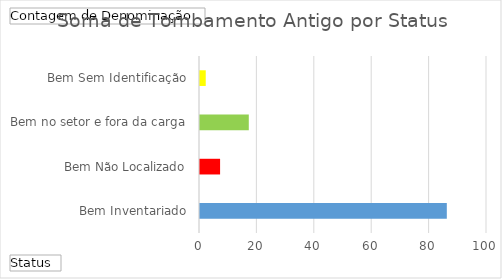
| Category | Total |
|---|---|
| Bem Inventariado | 86 |
| Bem Não Localizado | 7 |
| Bem no setor e fora da carga | 17 |
| Bem Sem Identificação | 2 |